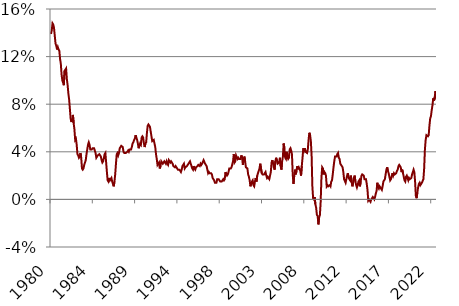
| Category | Series 0 |
|---|---|
| 1980.0 | 0.139 |
| 1980.0 | 0.142 |
| 1980.0 | 0.148 |
| 1980.0 | 0.147 |
| 1980.0 | 0.144 |
| 1980.0 | 0.144 |
| 1980.0 | 0.131 |
| 1980.0 | 0.129 |
| 1980.0 | 0.126 |
| 1980.0 | 0.128 |
| 1980.0 | 0.126 |
| 1980.0 | 0.125 |
| 1981.0 | 0.118 |
| 1981.0 | 0.114 |
| 1981.0 | 0.105 |
| 1981.0 | 0.1 |
| 1981.0 | 0.098 |
| 1981.0 | 0.096 |
| 1981.0 | 0.108 |
| 1981.0 | 0.108 |
| 1981.0 | 0.11 |
| 1981.0 | 0.101 |
| 1981.0 | 0.096 |
| 1981.0 | 0.089 |
| 1982.0 | 0.084 |
| 1982.0 | 0.076 |
| 1982.0 | 0.068 |
| 1982.0 | 0.065 |
| 1982.0 | 0.067 |
| 1982.0 | 0.071 |
| 1982.0 | 0.064 |
| 1982.0 | 0.059 |
| 1982.0 | 0.05 |
| 1982.0 | 0.051 |
| 1982.0 | 0.046 |
| 1982.0 | 0.038 |
| 1983.0 | 0.037 |
| 1983.0 | 0.035 |
| 1983.0 | 0.036 |
| 1983.0 | 0.039 |
| 1983.0 | 0.035 |
| 1983.0 | 0.026 |
| 1983.0 | 0.025 |
| 1983.0 | 0.026 |
| 1983.0 | 0.029 |
| 1983.0 | 0.029 |
| 1983.0 | 0.033 |
| 1983.0 | 0.038 |
| 1984.0 | 0.042 |
| 1984.0 | 0.046 |
| 1984.0 | 0.048 |
| 1984.0 | 0.046 |
| 1984.0 | 0.042 |
| 1984.0 | 0.042 |
| 1984.0 | 0.042 |
| 1984.0 | 0.043 |
| 1984.0 | 0.043 |
| 1984.0 | 0.043 |
| 1984.0 | 0.041 |
| 1984.0 | 0.039 |
| 1985.0 | 0.035 |
| 1985.0 | 0.035 |
| 1985.0 | 0.037 |
| 1985.0 | 0.037 |
| 1985.0 | 0.038 |
| 1985.0 | 0.038 |
| 1985.0 | 0.036 |
| 1985.0 | 0.033 |
| 1985.0 | 0.031 |
| 1985.0 | 0.032 |
| 1985.0 | 0.035 |
| 1985.0 | 0.038 |
| 1986.0 | 0.039 |
| 1986.0 | 0.031 |
| 1986.0 | 0.023 |
| 1986.0 | 0.016 |
| 1986.0 | 0.015 |
| 1986.0 | 0.018 |
| 1986.0 | 0.016 |
| 1986.0 | 0.016 |
| 1986.0 | 0.018 |
| 1986.0 | 0.015 |
| 1986.0 | 0.013 |
| 1986.0 | 0.011 |
| 1987.0 | 0.015 |
| 1987.0 | 0.021 |
| 1987.0 | 0.03 |
| 1987.0 | 0.038 |
| 1987.0 | 0.039 |
| 1987.0 | 0.037 |
| 1987.0 | 0.039 |
| 1987.0 | 0.043 |
| 1987.0 | 0.044 |
| 1987.0 | 0.045 |
| 1987.0 | 0.045 |
| 1987.0 | 0.044 |
| 1988.0 | 0.04 |
| 1988.0 | 0.039 |
| 1988.0 | 0.039 |
| 1988.0 | 0.039 |
| 1988.0 | 0.039 |
| 1988.0 | 0.04 |
| 1988.0 | 0.041 |
| 1988.0 | 0.04 |
| 1988.0 | 0.042 |
| 1988.0 | 0.042 |
| 1988.0 | 0.042 |
| 1988.0 | 0.044 |
| 1989.0 | 0.047 |
| 1989.0 | 0.048 |
| 1989.0 | 0.05 |
| 1989.0 | 0.051 |
| 1989.0 | 0.054 |
| 1989.0 | 0.052 |
| 1989.0 | 0.05 |
| 1989.0 | 0.047 |
| 1989.0 | 0.043 |
| 1989.0 | 0.045 |
| 1989.0 | 0.047 |
| 1989.0 | 0.046 |
| 1990.0 | 0.052 |
| 1990.0 | 0.053 |
| 1990.0 | 0.052 |
| 1990.0 | 0.047 |
| 1990.0 | 0.044 |
| 1990.0 | 0.047 |
| 1990.0 | 0.048 |
| 1990.0 | 0.056 |
| 1990.0 | 0.062 |
| 1990.0 | 0.063 |
| 1990.0 | 0.063 |
| 1990.0 | 0.061 |
| 1991.0 | 0.057 |
| 1991.0 | 0.053 |
| 1991.0 | 0.049 |
| 1991.0 | 0.049 |
| 1991.0 | 0.05 |
| 1991.0 | 0.047 |
| 1991.0 | 0.044 |
| 1991.0 | 0.038 |
| 1991.0 | 0.034 |
| 1991.0 | 0.029 |
| 1991.0 | 0.03 |
| 1991.0 | 0.031 |
| 1992.0 | 0.026 |
| 1992.0 | 0.028 |
| 1992.0 | 0.032 |
| 1992.0 | 0.032 |
| 1992.0 | 0.03 |
| 1992.0 | 0.031 |
| 1992.0 | 0.032 |
| 1992.0 | 0.031 |
| 1992.0 | 0.03 |
| 1992.0 | 0.032 |
| 1992.0 | 0.03 |
| 1992.0 | 0.029 |
| 1993.0 | 0.033 |
| 1993.0 | 0.032 |
| 1993.0 | 0.031 |
| 1993.0 | 0.032 |
| 1993.0 | 0.032 |
| 1993.0 | 0.03 |
| 1993.0 | 0.028 |
| 1993.0 | 0.028 |
| 1993.0 | 0.027 |
| 1993.0 | 0.028 |
| 1993.0 | 0.027 |
| 1993.0 | 0.027 |
| 1994.0 | 0.025 |
| 1994.0 | 0.025 |
| 1994.0 | 0.025 |
| 1994.0 | 0.024 |
| 1994.0 | 0.023 |
| 1994.0 | 0.025 |
| 1994.0 | 0.028 |
| 1994.0 | 0.029 |
| 1994.0 | 0.03 |
| 1994.0 | 0.026 |
| 1994.0 | 0.027 |
| 1994.0 | 0.027 |
| 1995.0 | 0.028 |
| 1995.0 | 0.029 |
| 1995.0 | 0.029 |
| 1995.0 | 0.031 |
| 1995.0 | 0.032 |
| 1995.0 | 0.03 |
| 1995.0 | 0.028 |
| 1995.0 | 0.026 |
| 1995.0 | 0.025 |
| 1995.0 | 0.028 |
| 1995.0 | 0.026 |
| 1995.0 | 0.025 |
| 1996.0 | 0.027 |
| 1996.0 | 0.027 |
| 1996.0 | 0.028 |
| 1996.0 | 0.029 |
| 1996.0 | 0.029 |
| 1996.0 | 0.028 |
| 1996.0 | 0.03 |
| 1996.0 | 0.029 |
| 1996.0 | 0.03 |
| 1996.0 | 0.03 |
| 1996.0 | 0.033 |
| 1996.0 | 0.033 |
| 1997.0 | 0.03 |
| 1997.0 | 0.03 |
| 1997.0 | 0.028 |
| 1997.0 | 0.025 |
| 1997.0 | 0.022 |
| 1997.0 | 0.023 |
| 1997.0 | 0.022 |
| 1997.0 | 0.022 |
| 1997.0 | 0.022 |
| 1997.0 | 0.021 |
| 1997.0 | 0.018 |
| 1997.0 | 0.017 |
| 1998.0 | 0.016 |
| 1998.0 | 0.014 |
| 1998.0 | 0.014 |
| 1998.0 | 0.014 |
| 1998.0 | 0.017 |
| 1998.0 | 0.017 |
| 1998.0 | 0.017 |
| 1998.0 | 0.016 |
| 1998.0 | 0.015 |
| 1998.0 | 0.015 |
| 1998.0 | 0.015 |
| 1998.0 | 0.016 |
| 1999.0 | 0.017 |
| 1999.0 | 0.016 |
| 1999.0 | 0.017 |
| 1999.0 | 0.023 |
| 1999.0 | 0.021 |
| 1999.0 | 0.02 |
| 1999.0 | 0.021 |
| 1999.0 | 0.023 |
| 1999.0 | 0.026 |
| 1999.0 | 0.026 |
| 1999.0 | 0.026 |
| 1999.0 | 0.027 |
| 2000.0 | 0.027 |
| 2000.0 | 0.032 |
| 2000.0 | 0.038 |
| 2000.0 | 0.031 |
| 2000.0 | 0.032 |
| 2000.0 | 0.037 |
| 2000.0 | 0.037 |
| 2000.0 | 0.034 |
| 2000.0 | 0.035 |
| 2000.0 | 0.034 |
| 2000.0 | 0.034 |
| 2000.0 | 0.034 |
| 2001.0 | 0.037 |
| 2001.0 | 0.035 |
| 2001.0 | 0.029 |
| 2001.0 | 0.033 |
| 2001.0 | 0.036 |
| 2001.0 | 0.032 |
| 2001.0 | 0.027 |
| 2001.0 | 0.027 |
| 2001.0 | 0.026 |
| 2001.0 | 0.021 |
| 2001.0 | 0.019 |
| 2001.0 | 0.016 |
| 2002.0 | 0.011 |
| 2002.0 | 0.011 |
| 2002.0 | 0.015 |
| 2002.0 | 0.016 |
| 2002.0 | 0.012 |
| 2002.0 | 0.011 |
| 2002.0 | 0.015 |
| 2002.0 | 0.018 |
| 2002.0 | 0.015 |
| 2002.0 | 0.02 |
| 2002.0 | 0.022 |
| 2002.0 | 0.024 |
| 2003.0 | 0.026 |
| 2003.0 | 0.03 |
| 2003.0 | 0.03 |
| 2003.0 | 0.022 |
| 2003.0 | 0.021 |
| 2003.0 | 0.021 |
| 2003.0 | 0.021 |
| 2003.0 | 0.022 |
| 2003.0 | 0.023 |
| 2003.0 | 0.02 |
| 2003.0 | 0.018 |
| 2003.0 | 0.019 |
| 2004.0 | 0.019 |
| 2004.0 | 0.017 |
| 2004.0 | 0.017 |
| 2004.0 | 0.023 |
| 2004.0 | 0.031 |
| 2004.0 | 0.033 |
| 2004.0 | 0.03 |
| 2004.0 | 0.027 |
| 2004.0 | 0.025 |
| 2004.0 | 0.032 |
| 2004.0 | 0.035 |
| 2004.0 | 0.033 |
| 2005.0 | 0.03 |
| 2005.0 | 0.03 |
| 2005.0 | 0.031 |
| 2005.0 | 0.035 |
| 2005.0 | 0.028 |
| 2005.0 | 0.025 |
| 2005.0 | 0.032 |
| 2005.0 | 0.036 |
| 2005.0 | 0.047 |
| 2005.0 | 0.043 |
| 2005.0 | 0.035 |
| 2005.0 | 0.034 |
| 2006.0 | 0.04 |
| 2006.0 | 0.036 |
| 2006.0 | 0.034 |
| 2006.0 | 0.035 |
| 2006.0 | 0.042 |
| 2006.0 | 0.043 |
| 2006.0 | 0.041 |
| 2006.0 | 0.038 |
| 2006.0 | 0.021 |
| 2006.0 | 0.013 |
| 2006.0 | 0.02 |
| 2006.0 | 0.025 |
| 2007.0 | 0.021 |
| 2007.0 | 0.024 |
| 2007.0 | 0.028 |
| 2007.0 | 0.026 |
| 2007.0 | 0.027 |
| 2007.0 | 0.027 |
| 2007.0 | 0.024 |
| 2007.0 | 0.02 |
| 2007.0 | 0.028 |
| 2007.0 | 0.035 |
| 2007.0 | 0.043 |
| 2007.0 | 0.041 |
| 2008.0 | 0.043 |
| 2008.0 | 0.04 |
| 2008.0 | 0.04 |
| 2008.0 | 0.039 |
| 2008.0 | 0.042 |
| 2008.0 | 0.05 |
| 2008.0 | 0.056 |
| 2008.0 | 0.054 |
| 2008.0 | 0.049 |
| 2008.0 | 0.037 |
| 2008.0 | 0.011 |
| 2008.0 | 0.001 |
| 2009.0 | 0 |
| 2009.0 | 0.002 |
| 2009.0 | -0.004 |
| 2009.0 | -0.007 |
| 2009.0 | -0.013 |
| 2009.0 | -0.014 |
| 2009.0 | -0.021 |
| 2009.0 | -0.015 |
| 2009.0 | -0.013 |
| 2009.0 | -0.002 |
| 2009.0 | 0.018 |
| 2009.0 | 0.027 |
| 2010.0 | 0.026 |
| 2010.0 | 0.021 |
| 2010.0 | 0.023 |
| 2010.0 | 0.022 |
| 2010.0 | 0.02 |
| 2010.0 | 0.011 |
| 2010.0 | 0.012 |
| 2010.0 | 0.011 |
| 2010.0 | 0.011 |
| 2010.0 | 0.012 |
| 2010.0 | 0.011 |
| 2010.0 | 0.015 |
| 2011.0 | 0.016 |
| 2011.0 | 0.021 |
| 2011.0 | 0.027 |
| 2011.0 | 0.032 |
| 2011.0 | 0.036 |
| 2011.0 | 0.036 |
| 2011.0 | 0.036 |
| 2011.0 | 0.038 |
| 2011.0 | 0.039 |
| 2011.0 | 0.035 |
| 2011.0 | 0.034 |
| 2011.0 | 0.03 |
| 2012.0 | 0.029 |
| 2012.0 | 0.029 |
| 2012.0 | 0.027 |
| 2012.0 | 0.023 |
| 2012.0 | 0.017 |
| 2012.0 | 0.017 |
| 2012.0 | 0.014 |
| 2012.0 | 0.017 |
| 2012.0 | 0.02 |
| 2012.0 | 0.022 |
| 2012.0 | 0.018 |
| 2012.0 | 0.017 |
| 2013.0 | 0.016 |
| 2013.0 | 0.02 |
| 2013.0 | 0.015 |
| 2013.0 | 0.011 |
| 2013.0 | 0.014 |
| 2013.0 | 0.018 |
| 2013.0 | 0.02 |
| 2013.0 | 0.015 |
| 2013.0 | 0.012 |
| 2013.0 | 0.01 |
| 2013.0 | 0.012 |
| 2013.0 | 0.015 |
| 2014.0 | 0.016 |
| 2014.0 | 0.011 |
| 2014.0 | 0.015 |
| 2014.0 | 0.02 |
| 2014.0 | 0.021 |
| 2014.0 | 0.021 |
| 2014.0 | 0.02 |
| 2014.0 | 0.017 |
| 2014.0 | 0.017 |
| 2014.0 | 0.017 |
| 2014.0 | 0.013 |
| 2014.0 | 0.008 |
| 2015.0 | -0.001 |
| 2015.0 | 0 |
| 2015.0 | -0.001 |
| 2015.0 | -0.002 |
| 2015.0 | 0 |
| 2015.0 | 0.001 |
| 2015.0 | 0.002 |
| 2015.0 | 0.002 |
| 2015.0 | 0 |
| 2015.0 | 0.002 |
| 2015.0 | 0.005 |
| 2015.0 | 0.007 |
| 2016.0 | 0.014 |
| 2016.0 | 0.01 |
| 2016.0 | 0.009 |
| 2016.0 | 0.011 |
| 2016.0 | 0.01 |
| 2016.0 | 0.01 |
| 2016.0 | 0.008 |
| 2016.0 | 0.011 |
| 2016.0 | 0.015 |
| 2016.0 | 0.016 |
| 2016.0 | 0.017 |
| 2016.0 | 0.021 |
| 2017.0 | 0.025 |
| 2017.0 | 0.027 |
| 2017.0 | 0.024 |
| 2017.0 | 0.022 |
| 2017.0 | 0.019 |
| 2017.0 | 0.016 |
| 2017.0 | 0.017 |
| 2017.0 | 0.019 |
| 2017.0 | 0.022 |
| 2017.0 | 0.02 |
| 2017.0 | 0.022 |
| 2017.0 | 0.021 |
| 2018.0 | 0.021 |
| 2018.0 | 0.022 |
| 2018.0 | 0.024 |
| 2018.0 | 0.025 |
| 2018.0 | 0.028 |
| 2018.0 | 0.029 |
| 2018.0 | 0.029 |
| 2018.0 | 0.027 |
| 2018.0 | 0.023 |
| 2018.0 | 0.025 |
| 2018.0 | 0.022 |
| 2018.0 | 0.019 |
| 2019.0 | 0.016 |
| 2019.0 | 0.015 |
| 2019.0 | 0.019 |
| 2019.0 | 0.02 |
| 2019.0 | 0.018 |
| 2019.0 | 0.016 |
| 2019.0 | 0.018 |
| 2019.0 | 0.017 |
| 2019.0 | 0.017 |
| 2019.0 | 0.018 |
| 2019.0 | 0.021 |
| 2019.0 | 0.023 |
| 2020.0 | 0.025 |
| 2020.0 | 0.023 |
| 2020.0 | 0.015 |
| 2020.0 | 0.003 |
| 2020.0 | 0.001 |
| 2020.0 | 0.006 |
| 2020.0 | 0.01 |
| 2020.0 | 0.013 |
| 2020.0 | 0.014 |
| 2020.0 | 0.012 |
| 2020.0 | 0.012 |
| 2020.0 | 0.014 |
| 2021.0 | 0.014 |
| 2021.0 | 0.017 |
| 2021.0 | 0.026 |
| 2021.0 | 0.042 |
| 2021.0 | 0.05 |
| 2021.0 | 0.054 |
| 2021.0 | 0.054 |
| 2021.0 | 0.053 |
| 2021.0 | 0.054 |
| 2021.0 | 0.062 |
| 2021.0 | 0.068 |
| 2021.0 | 0.07 |
| 2022.0 | 0.075 |
| 2022.0 | 0.079 |
| 2022.0 | 0.085 |
| 2022.0 | 0.083 |
| 2022.0 | 0.086 |
| 2022.0 | 0.091 |
| 2022.0 | 0.085 |
| 2022.0 | 0.083 |